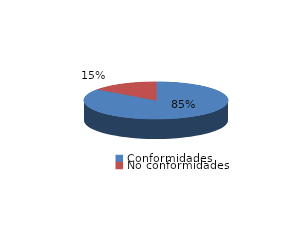
| Category | Series 0 |
|---|---|
| Conformidades | 1128 |
| No conformidades | 199 |